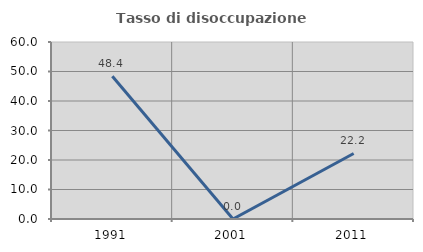
| Category | Tasso di disoccupazione giovanile  |
|---|---|
| 1991.0 | 48.387 |
| 2001.0 | 0 |
| 2011.0 | 22.222 |